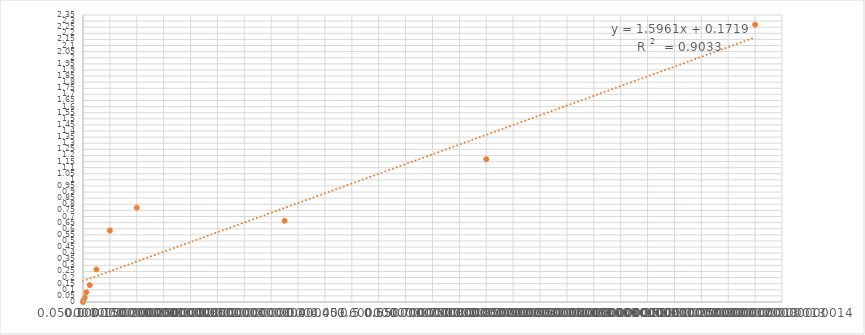
| Category | Series 1 |
|---|---|
| 0.0 | 0 |
| 0.001 | 0.017 |
| 0.003 | 0.036 |
| 0.00625 | 0.079 |
| 0.0125 | 0.138 |
| 0.025 | 0.267 |
| 0.05 | 0.585 |
| 0.1 | 0.772 |
| 0.375 | 0.665 |
| 0.75 | 1.169 |
| 1.25 | 2.27 |